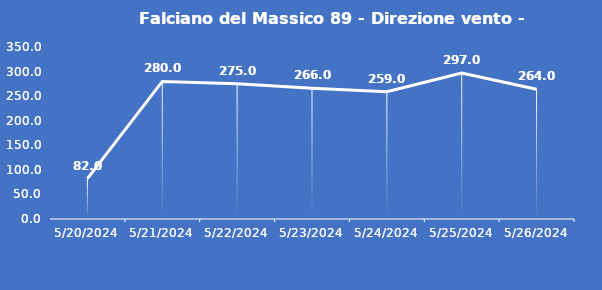
| Category | Falciano del Massico 89 - Direzione vento - Grezzo (°N) |
|---|---|
| 5/20/24 | 82 |
| 5/21/24 | 280 |
| 5/22/24 | 275 |
| 5/23/24 | 266 |
| 5/24/24 | 259 |
| 5/25/24 | 297 |
| 5/26/24 | 264 |